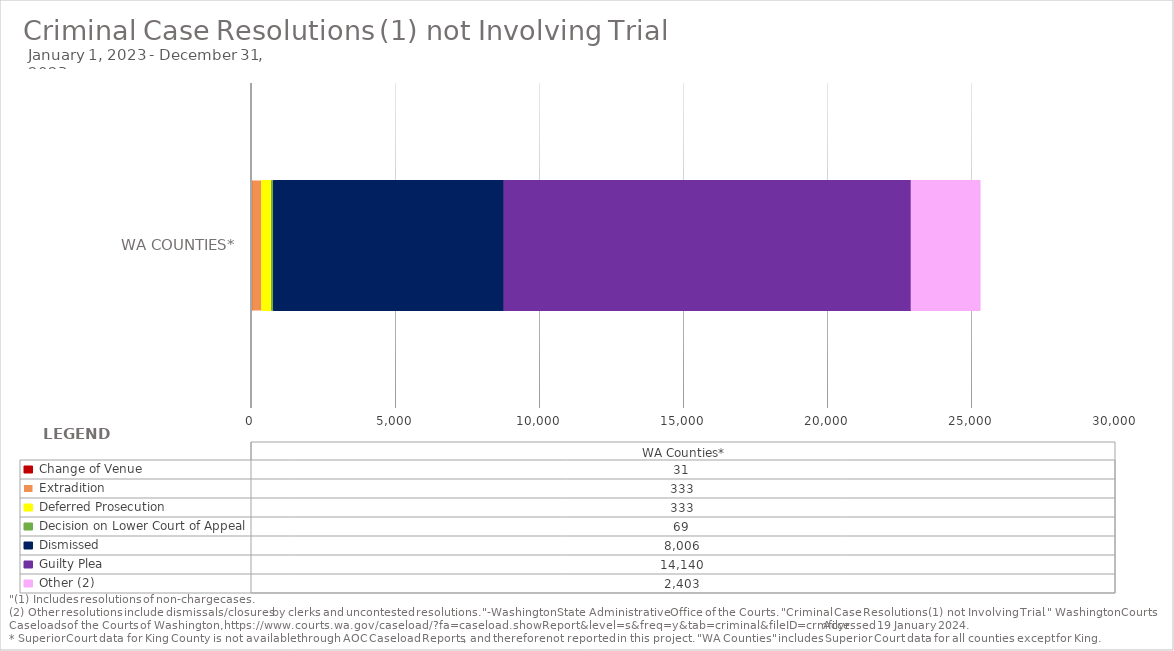
| Category |  Change of Venue  |  Extradition  |  Deferred Prosecution  |  Decision on Lower Court of Appeal  |  Dismissed  |  Guilty Plea  |  Other (2)  |
|---|---|---|---|---|---|---|---|
|  WA Counties* | 31 | 333 | 333 | 69 | 8006 | 14140 | 2403 |